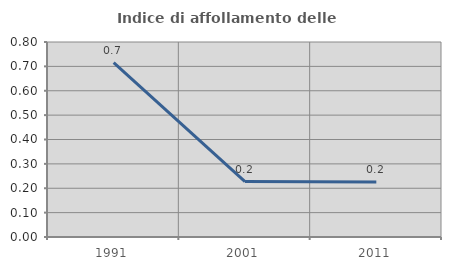
| Category | Indice di affollamento delle abitazioni  |
|---|---|
| 1991.0 | 0.715 |
| 2001.0 | 0.227 |
| 2011.0 | 0.226 |